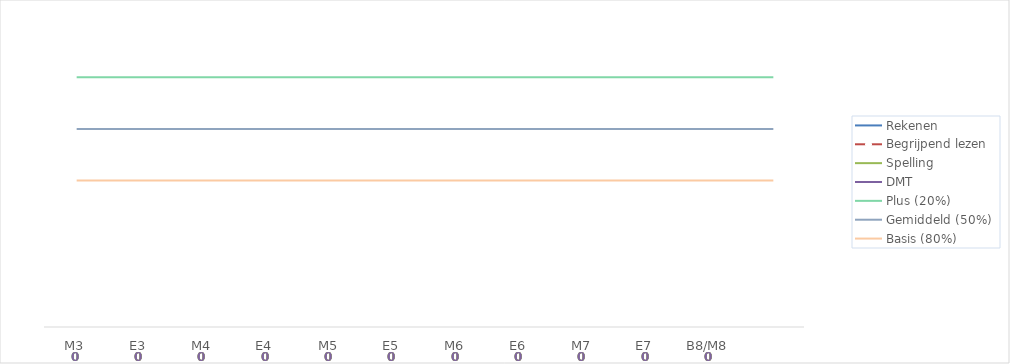
| Category | Rekenen | Begrijpend lezen | Spelling | DMT | Series 7 | Plus (20%) | Gemiddeld (50%) | Basis (80%) |
|---|---|---|---|---|---|---|---|---|
| M3 |  |  |  |  |  | 213 | 200 | 187 |
| E3 |  |  |  |  |  | 213 | 200 | 187 |
| M4 |  |  |  |  |  | 213 | 200 | 187 |
| E4 |  |  |  |  |  | 213 | 200 | 187 |
| M5 |  |  |  |  |  | 213 | 200 | 187 |
| E5 |  |  |  |  |  | 213 | 200 | 187 |
| M6 |  |  |  |  |  | 213 | 200 | 187 |
| E6 |  |  |  |  |  | 213 | 200 | 187 |
| M7 |  |  |  |  |  | 213 | 200 | 187 |
| E7 |  |  |  |  |  | 213 | 200 | 187 |
| B8/M8 |  |  |  |  |  | 213 | 200 | 187 |